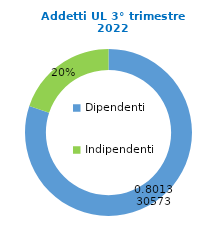
| Category | Series 0 |
|---|---|
| Dipendenti | 104911 |
| Indipendenti | 26010 |